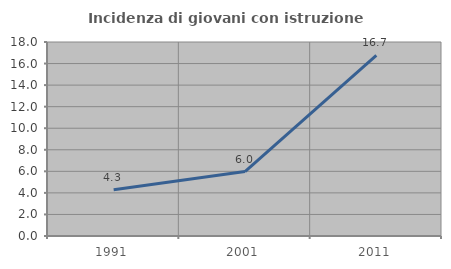
| Category | Incidenza di giovani con istruzione universitaria |
|---|---|
| 1991.0 | 4.286 |
| 2001.0 | 5.976 |
| 2011.0 | 16.749 |